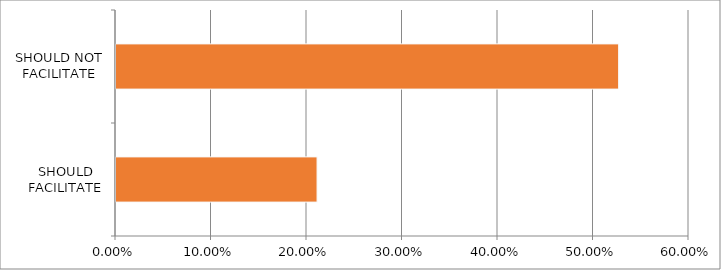
| Category | Series 0 |
|---|---|
| SHOULD FACILITATE | 0.211 |
| SHOULD NOT FACILITATE | 0.526 |